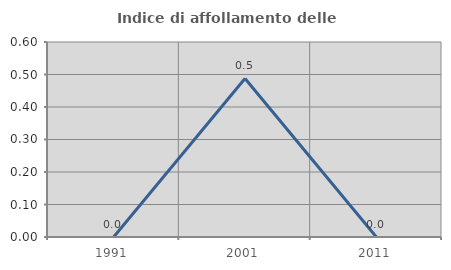
| Category | Indice di affollamento delle abitazioni  |
|---|---|
| 1991.0 | 0 |
| 2001.0 | 0.488 |
| 2011.0 | 0 |